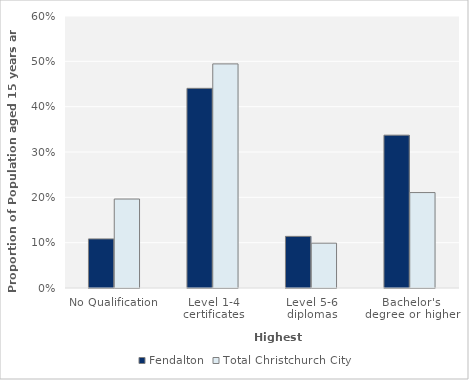
| Category | Fendalton | Total Christchurch City |
|---|---|---|
| No Qualification | 0.108 | 0.196 |
| Level 1-4 certificates | 0.44 | 0.494 |
| Level 5-6 diplomas | 0.114 | 0.099 |
| Bachelor's degree or higher | 0.337 | 0.211 |